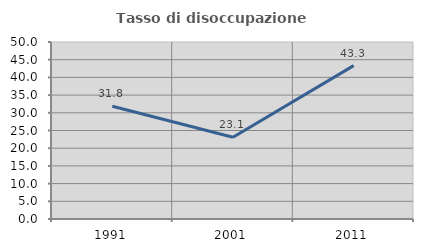
| Category | Tasso di disoccupazione giovanile  |
|---|---|
| 1991.0 | 31.847 |
| 2001.0 | 23.077 |
| 2011.0 | 43.333 |